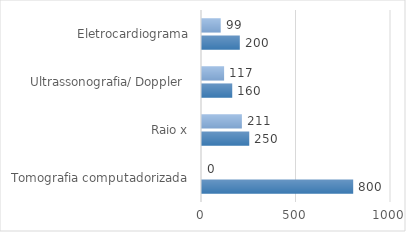
| Category | Series 0 | Series 1 |
|---|---|---|
| Tomografia computadorizada | 800 | 0 |
| Raio x | 250 | 211 |
| Ultrassonografia/ Doppler  | 160 | 117 |
| Eletrocardiograma | 200 | 99 |